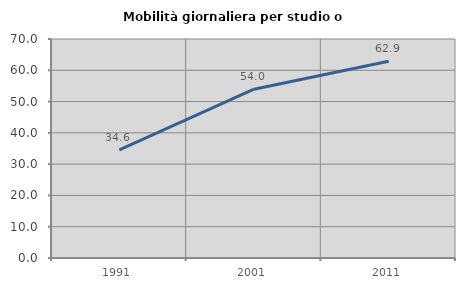
| Category | Mobilità giornaliera per studio o lavoro |
|---|---|
| 1991.0 | 34.586 |
| 2001.0 | 53.968 |
| 2011.0 | 62.903 |